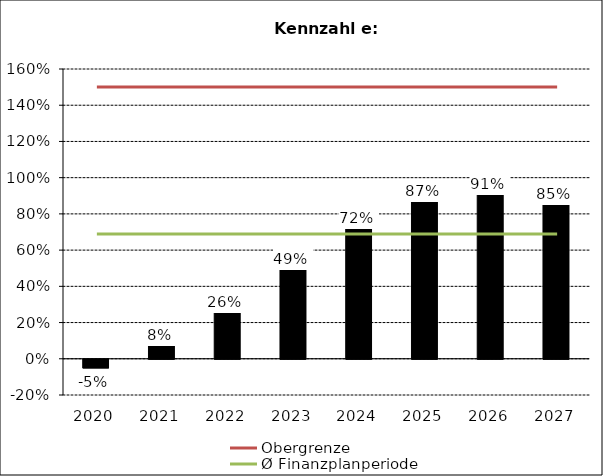
| Category | Nettoverschuildungsquotient |
|---|---|
| 2020.0 | -0.048 |
| 2021.0 | 0.076 |
| 2022.0 | 0.259 |
| 2023.0 | 0.494 |
| 2024.0 | 0.722 |
| 2025.0 | 0.872 |
| 2026.0 | 0.91 |
| 2027.0 | 0.854 |